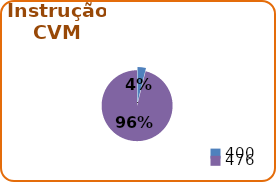
| Category | Instrução CVM |
|---|---|
| 400.0 | 1 |
| 476.0 | 25 |